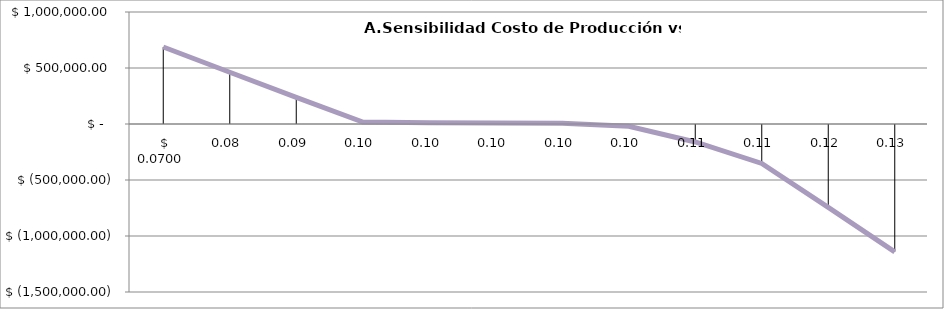
| Category | VAN |
|---|---|
| 0.07 | 687406.53 |
| 0.08 | 462381.6 |
| 0.09 | 237356.67 |
| 0.0995 | 17499.85 |
| 0.0998 | 10422.32 |
| 0.0999 | 8063.14 |
| 0.1 | 5703.96 |
| 0.101 | -20130.39 |
| 0.105 | -160542.06 |
| 0.11 | -352023.98 |
| 0.12 | -745163.78 |
| 0.13 | -1141251.99 |